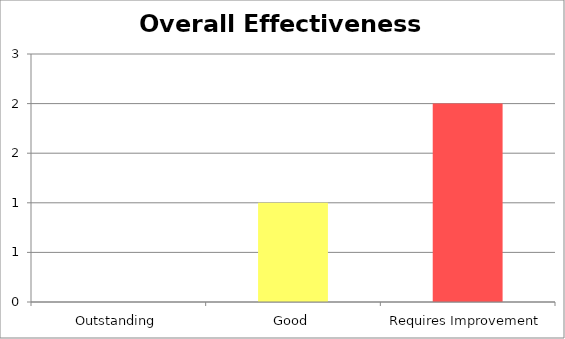
| Category | Series 0 |
|---|---|
| 0 | 0 |
| 1 | 1 |
| 2 | 2 |